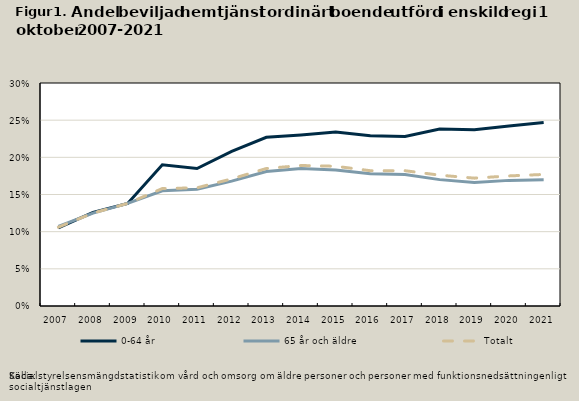
| Category | 0-64 år | 65 år och äldre | Totalt |
|---|---|---|---|
| 2007.0 | 0.105 | 0.107 | 0.106 |
| 2008.0 | 0.126 | 0.125 | 0.125 |
| 2009.0 | 0.138 | 0.138 | 0.138 |
| 2010.0 | 0.19 | 0.155 | 0.158 |
| 2011.0 | 0.185 | 0.157 | 0.159 |
| 2012.0 | 0.208 | 0.168 | 0.171 |
| 2013.0 | 0.227 | 0.181 | 0.185 |
| 2014.0 | 0.23 | 0.185 | 0.189 |
| 2015.0 | 0.234 | 0.183 | 0.188 |
| 2016.0 | 0.229 | 0.178 | 0.182 |
| 2017.0 | 0.228 | 0.177 | 0.182 |
| 2018.0 | 0.238 | 0.17 | 0.176 |
| 2019.0 | 0.237 | 0.166 | 0.172 |
| 2020.0 | 0.242 | 0.169 | 0.175 |
| 2021.0 | 0.247 | 0.17 | 0.177 |